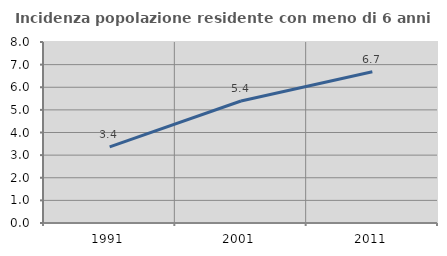
| Category | Incidenza popolazione residente con meno di 6 anni |
|---|---|
| 1991.0 | 3.364 |
| 2001.0 | 5.391 |
| 2011.0 | 6.683 |